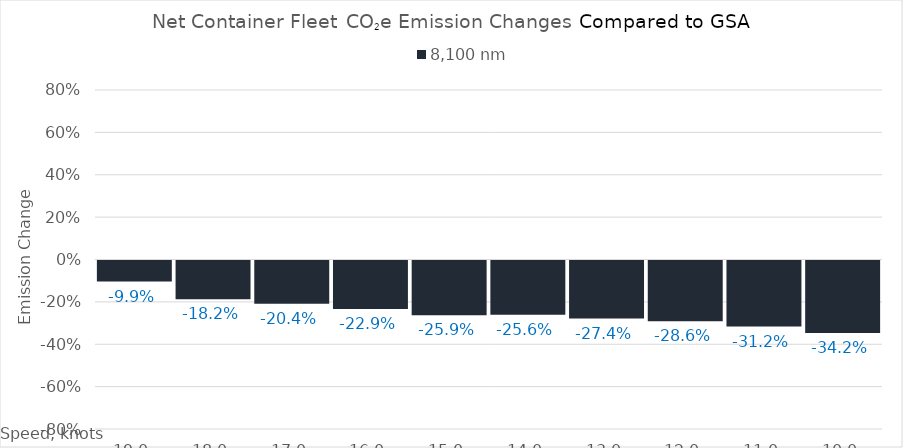
| Category | 8,100 |
|---|---|
| 19.0 | -0.099 |
| 18.0 | -0.182 |
| 17.0 | -0.204 |
| 16.0 | -0.229 |
| 15.0 | -0.259 |
| 14.0 | -0.256 |
| 13.0 | -0.274 |
| 12.0 | -0.286 |
| 11.0 | -0.312 |
| 10.0 | -0.342 |